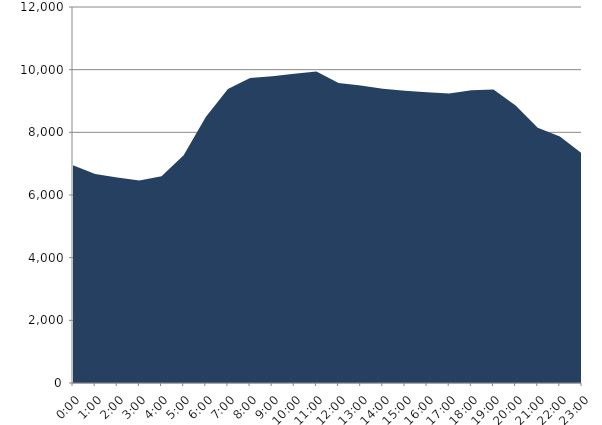
| Category | Series 0 | Series 1 |
|---|---|---|
| 2017-09-20 |  | 6952.71 |
| 2017-09-20 01:00:00 |  | 6671.39 |
| 2017-09-20 02:00:00 |  | 6562.39 |
| 2017-09-20 03:00:00 |  | 6460.64 |
| 2017-09-20 04:00:00 |  | 6594.62 |
| 2017-09-20 05:00:00 |  | 7264.71 |
| 2017-09-20 06:00:00 |  | 8488.81 |
| 2017-09-20 07:00:00 |  | 9379.87 |
| 2017-09-20 08:00:00 |  | 9734.23 |
| 2017-09-20 09:00:00 |  | 9791.35 |
| 2017-09-20 10:00:00 |  | 9871.22 |
| 2017-09-20 11:00:00 |  | 9940.19 |
| 2017-09-20 12:00:00 |  | 9570.97 |
| 2017-09-20 13:00:00 |  | 9491.52 |
| 2017-09-20 14:00:00 |  | 9392.27 |
| 2017-09-20 15:00:00 |  | 9326.29 |
| 2017-09-20 16:00:00 |  | 9277.02 |
| 2017-09-20 17:00:00 |  | 9239.86 |
| 2017-09-20 18:00:00 |  | 9339.96 |
| 2017-09-20 19:00:00 |  | 9369.64 |
| 2017-09-20 20:00:00 |  | 8857.45 |
| 2017-09-20 21:00:00 |  | 8145.96 |
| 2017-09-20 22:00:00 |  | 7863.09 |
| 2017-09-20 23:00:00 |  | 7323.19 |